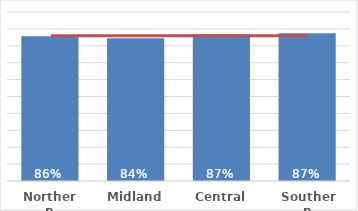
| Category | Total |
|---|---|
| Northern | 0.857 |
| Midland | 0.844 |
| Central | 0.869 |
| Southern | 0.874 |